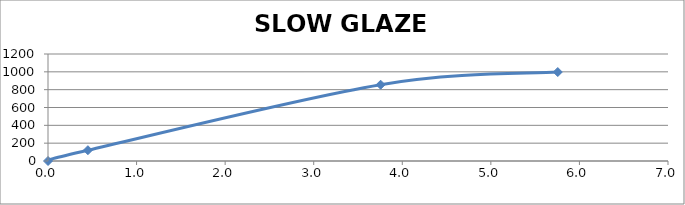
| Category | SLOW GLAZE CHART |
|---|---|
| 0.0 | 0 |
| 0.4505 | 121.111 |
| 3.755501 | 855.556 |
| 5.755497875 | 997.778 |